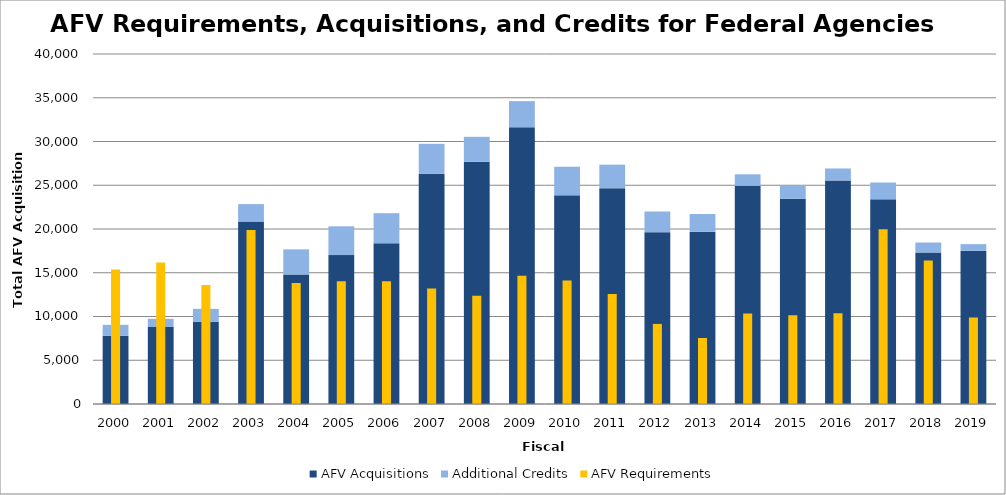
| Category | AFV Acquisitions | Additional Credits |
|---|---|---|
| 2000.0 | 7784 | 1265 |
| 2001.0 | 8798 | 938 |
| 2002.0 | 9387 | 1483 |
| 2003.0 | 20846 | 2000 |
| 2004.0 | 14811 | 2861 |
| 2005.0 | 17018 | 3290 |
| 2006.0 | 18369 | 3439 |
| 2007.0 | 26296 | 3441 |
| 2008.0 | 27696 | 2838 |
| 2009.0 | 31629 | 2985 |
| 2010.0 | 23845 | 3269 |
| 2011.0 | 24662 | 2691 |
| 2012.0 | 19639 | 2360 |
| 2013.0 | 19671 | 2042 |
| 2014.0 | 24930 | 1320 |
| 2015.0 | 23451 | 1543 |
| 2016.0 | 25547 | 1368 |
| 2017.0 | 23389 | 1924 |
| 2018.0 | 17310 | 1145 |
| 2019.0 | 17498 | 774 |